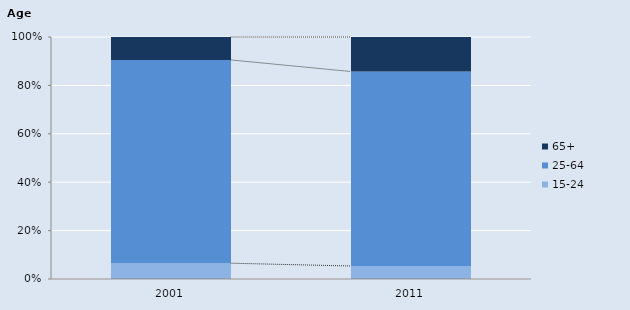
| Category | 15-24 | 25-64 | 65+            |
|---|---|---|---|
| 2001.0 | 82.238 | 1058.475 | 119.536 |
| 2011.0 | 77 | 1154 | 205 |